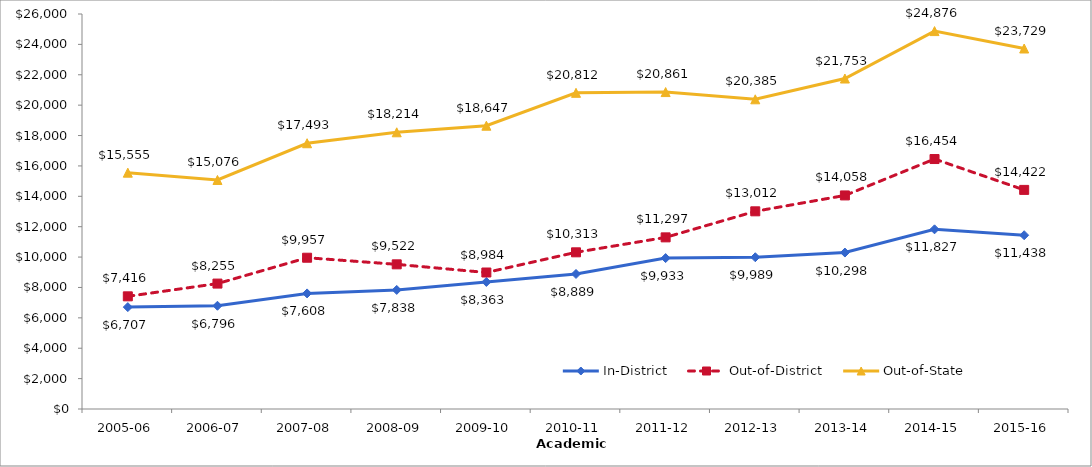
| Category | In-District | Out-of-District | Out-of-State |
|---|---|---|---|
| 2005-06 | 6707 | 7416 | 15555 |
| 2006-07 | 6796 | 8255 | 15076 |
| 2007-08 | 7608 | 9957 | 17493 |
| 2008-09 | 7838.053 | 9522.053 | 18213.684 |
| 2009-10 | 8363 | 8984 | 18647 |
| 2010-11 | 8889 | 10313 | 20812 |
| 2011-12 | 9933.23 | 11297.18 | 20861.23 |
| 2012-13 | 9988.67 | 13011.78 | 20384.67 |
| 2013-14 | 10297.84 | 14057.56 | 21753.28 |
| 2014-15 | 11827.062 | 16453.562 | 24875.688 |
| 2015-16 | 11438 | 14422 | 23729 |